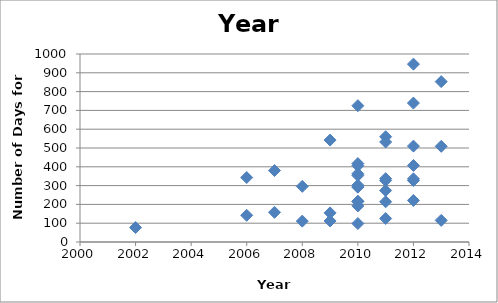
| Category | Series 0 |
|---|---|
| 2006.0 | 343 |
| 2007.0 | 380 |
| 2013.0 | 115 |
| 2010.0 | 98 |
| 2010.0 | 406 |
| 2008.0 | 296 |
| 2012.0 | 946 |
| 2012.0 | 336 |
| 2011.0 | 214 |
| 2012.0 | 221 |
| 2012.0 | 510 |
| 2010.0 | 217 |
| 2010.0 | 292 |
| 2010.0 | 363 |
| 2009.0 | 155 |
| 2010.0 | 192 |
| 2013.0 | 853 |
| 2011.0 | 274 |
| 2008.0 | 111 |
| 2002.0 | 77 |
| 2011.0 | 560 |
| 2011.0 | 337 |
| 2009.0 | 542 |
| 2011.0 | 125 |
| 2010.0 | 354 |
| 2013.0 | 509 |
| 2010.0 | 302 |
| 2011.0 | 532 |
| 2011.0 | 327 |
| 2010.0 | 417 |
| 2012.0 | 327 |
| 2010.0 | 215 |
| 2006.0 | 142 |
| 2007.0 | 158 |
| 2010.0 | 725 |
| 2012.0 | 739 |
| 2010.0 | 292 |
| 2009.0 | 112 |
| 2012.0 | 407 |